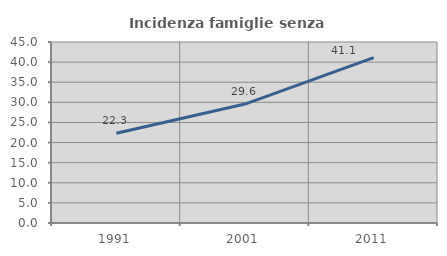
| Category | Incidenza famiglie senza nuclei |
|---|---|
| 1991.0 | 22.294 |
| 2001.0 | 29.575 |
| 2011.0 | 41.118 |